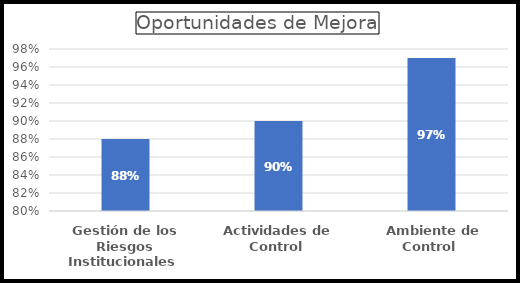
| Category | Series 0 |
|---|---|
| Gestión de los Riesgos Institucionales  | 0.88 |
| Actividades de Control  | 0.9 |
|  Ambiente de Control  | 0.97 |